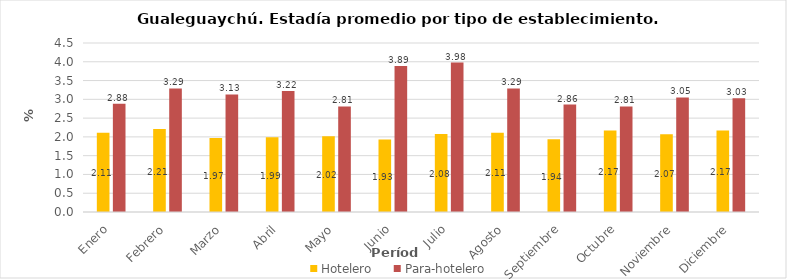
| Category | Hotelero | Para-hotelero |
|---|---|---|
| Enero | 2.11 | 2.88 |
| Febrero | 2.21 | 3.29 |
| Marzo | 1.97 | 3.13 |
| Abril | 1.99 | 3.22 |
| Mayo | 2.02 | 2.81 |
| Junio | 1.93 | 3.89 |
| Julio | 2.08 | 3.98 |
| Agosto | 2.11 | 3.29 |
| Septiembre | 1.94 | 2.86 |
| Octubre | 2.17 | 2.81 |
| Noviembre | 2.07 | 3.05 |
| Diciembre | 2.17 | 3.03 |